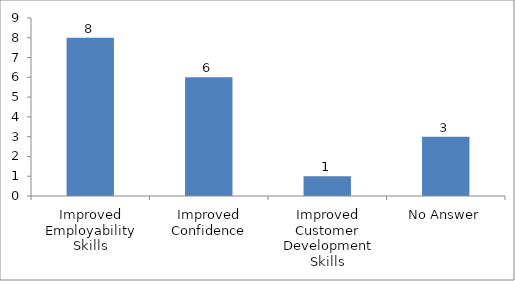
| Category | What are the main benefits of the social entrepreneurship program to your students? |
|---|---|
| Improved Employability Skills | 8 |
| Improved Confidence | 6 |
| Improved Customer Development Skills | 1 |
| No Answer | 3 |